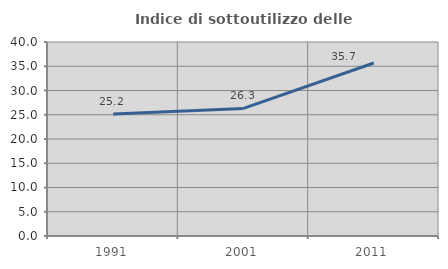
| Category | Indice di sottoutilizzo delle abitazioni  |
|---|---|
| 1991.0 | 25.161 |
| 2001.0 | 26.306 |
| 2011.0 | 35.663 |